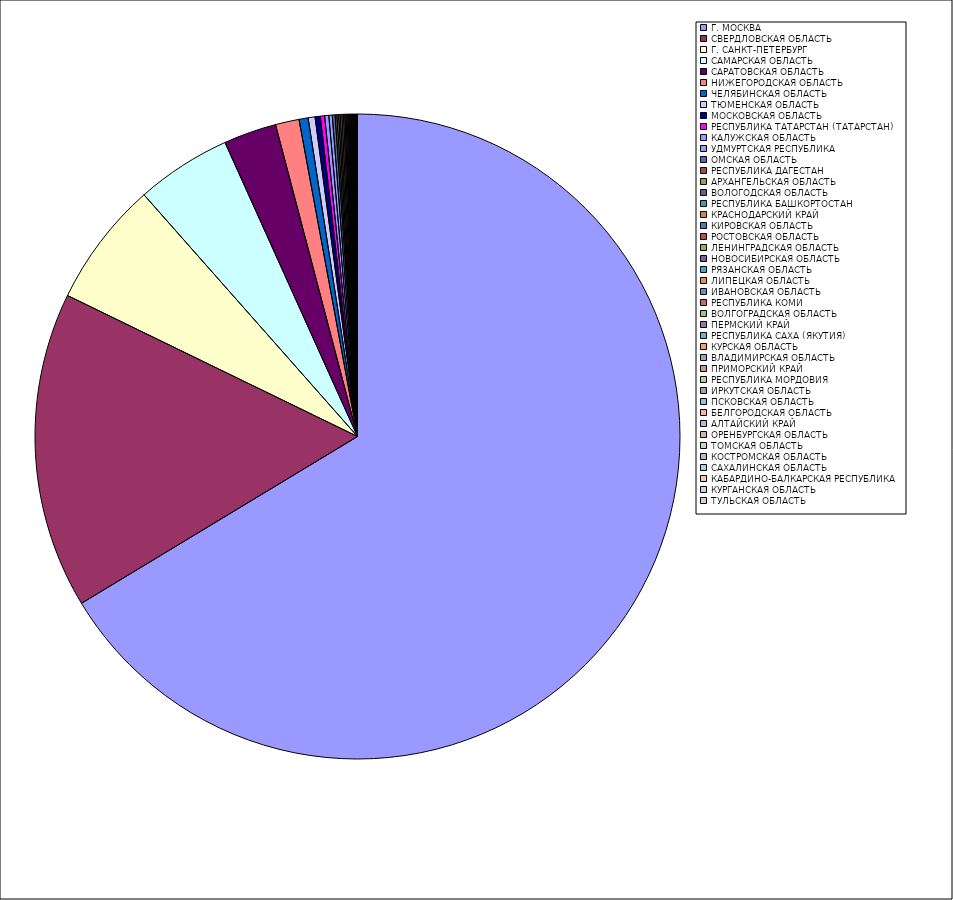
| Category | Оборот |
|---|---|
| Г. МОСКВА | 66.329 |
| СВЕРДЛОВСКАЯ ОБЛАСТЬ | 15.849 |
| Г. САНКТ-ПЕТЕРБУРГ | 6.279 |
| САМАРСКАЯ ОБЛАСТЬ | 4.776 |
| САРАТОВСКАЯ ОБЛАСТЬ | 2.647 |
| НИЖЕГОРОДСКАЯ ОБЛАСТЬ | 1.186 |
| ЧЕЛЯБИНСКАЯ ОБЛАСТЬ | 0.457 |
| ТЮМЕНСКАЯ ОБЛАСТЬ | 0.345 |
| МОСКОВСКАЯ ОБЛАСТЬ | 0.261 |
| РЕСПУБЛИКА ТАТАРСТАН (ТАТАРСТАН) | 0.214 |
| КАЛУЖСКАЯ ОБЛАСТЬ | 0.207 |
| УДМУРТСКАЯ РЕСПУБЛИКА | 0.173 |
| ОМСКАЯ ОБЛАСТЬ | 0.138 |
| РЕСПУБЛИКА ДАГЕСТАН | 0.089 |
| АРХАНГЕЛЬСКАЯ ОБЛАСТЬ | 0.084 |
| ВОЛОГОДСКАЯ ОБЛАСТЬ | 0.083 |
| РЕСПУБЛИКА БАШКОРТОСТАН | 0.082 |
| КРАСНОДАРСКИЙ КРАЙ | 0.078 |
| КИРОВСКАЯ ОБЛАСТЬ | 0.067 |
| РОСТОВСКАЯ ОБЛАСТЬ | 0.055 |
| ЛЕНИНГРАДСКАЯ ОБЛАСТЬ | 0.054 |
| НОВОСИБИРСКАЯ ОБЛАСТЬ | 0.049 |
| РЯЗАНСКАЯ ОБЛАСТЬ | 0.048 |
| ЛИПЕЦКАЯ ОБЛАСТЬ | 0.045 |
| ИВАНОВСКАЯ ОБЛАСТЬ | 0.039 |
| РЕСПУБЛИКА КОМИ | 0.036 |
| ВОЛГОГРАДСКАЯ ОБЛАСТЬ | 0.033 |
| ПЕРМСКИЙ КРАЙ | 0.03 |
| РЕСПУБЛИКА САХА (ЯКУТИЯ) | 0.029 |
| КУРСКАЯ ОБЛАСТЬ | 0.028 |
| ВЛАДИМИРСКАЯ ОБЛАСТЬ | 0.022 |
| ПРИМОРСКИЙ КРАЙ | 0.019 |
| РЕСПУБЛИКА МОРДОВИЯ | 0.019 |
| ИРКУТСКАЯ ОБЛАСТЬ | 0.018 |
| ПСКОВСКАЯ ОБЛАСТЬ | 0.018 |
| БЕЛГОРОДСКАЯ ОБЛАСТЬ | 0.017 |
| АЛТАЙСКИЙ КРАЙ | 0.011 |
| ОРЕНБУРГСКАЯ ОБЛАСТЬ | 0.009 |
| ТОМСКАЯ ОБЛАСТЬ | 0.009 |
| КОСТРОМСКАЯ ОБЛАСТЬ | 0.009 |
| САХАЛИНСКАЯ ОБЛАСТЬ | 0.008 |
| КАБАРДИНО-БАЛКАРСКАЯ РЕСПУБЛИКА | 0.008 |
| КУРГАНСКАЯ ОБЛАСТЬ | 0.007 |
| ТУЛЬСКАЯ ОБЛАСТЬ | 0.006 |